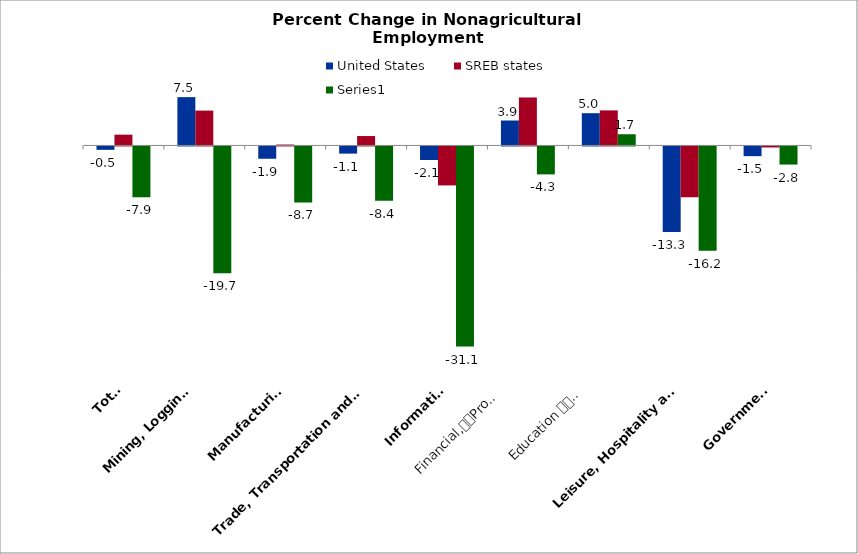
| Category | United States | SREB states | Series 0 |
|---|---|---|---|
| Total | -0.529 | 1.672 | -7.882 |
| Mining, Logging 
and Construction | 7.497 | 5.408 | -19.682 |
| Manufacturing | -1.912 | 0.138 | -8.681 |
| Trade, Transportation and Utilities | -1.113 | 1.46 | -8.441 |
| Information | -2.105 | -6.047 | -31.061 |
| Financial,
Professional and 
Business Services | 3.87 | 7.444 | -4.335 |
| Education 
and 
Health Services | 5.006 | 5.439 | 1.738 |
| Leisure, Hospitality and 
Other Services | -13.274 | -7.871 | -16.183 |
| Government | -1.507 | -0.159 | -2.812 |